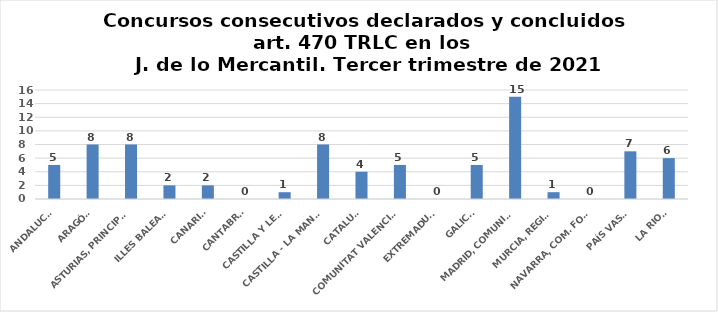
| Category | Series 0 |
|---|---|
| ANDALUCÍA | 5 |
| ARAGÓN | 8 |
| ASTURIAS, PRINCIPADO | 8 |
| ILLES BALEARS | 2 |
| CANARIAS | 2 |
| CANTABRIA | 0 |
| CASTILLA Y LEÓN | 1 |
| CASTILLA - LA MANCHA | 8 |
| CATALUÑA | 4 |
| COMUNITAT VALENCIANA | 5 |
| EXTREMADURA | 0 |
| GALICIA | 5 |
| MADRID, COMUNIDAD | 15 |
| MURCIA, REGIÓN | 1 |
| NAVARRA, COM. FORAL | 0 |
| PAÍS VASCO | 7 |
| LA RIOJA | 6 |